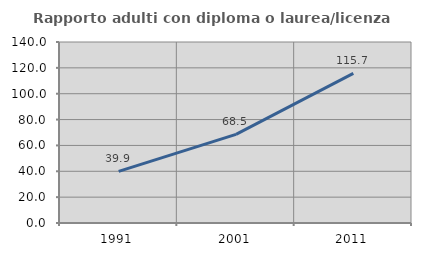
| Category | Rapporto adulti con diploma o laurea/licenza media  |
|---|---|
| 1991.0 | 39.877 |
| 2001.0 | 68.527 |
| 2011.0 | 115.67 |